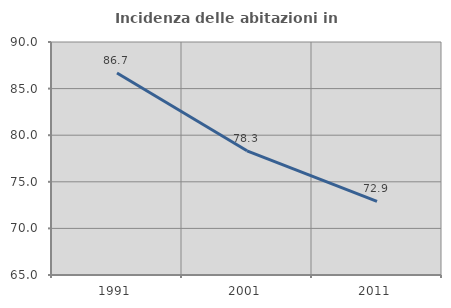
| Category | Incidenza delle abitazioni in proprietà  |
|---|---|
| 1991.0 | 86.679 |
| 2001.0 | 78.328 |
| 2011.0 | 72.907 |